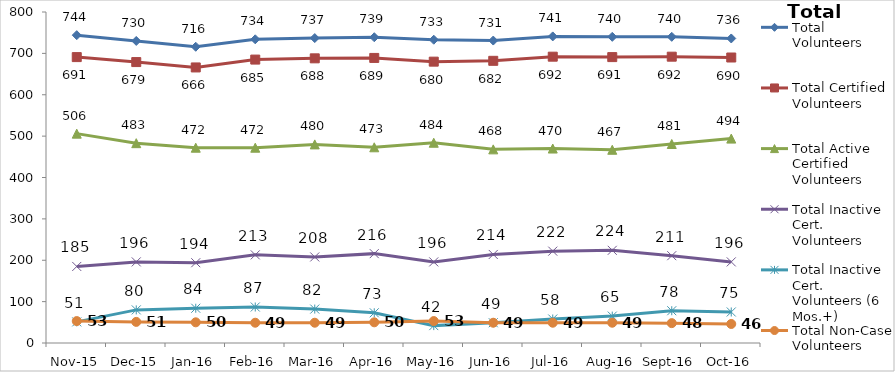
| Category | Total Volunteers | Total Certified Volunteers | Total Active Certified Volunteers | Total Inactive Cert. Volunteers | Total Inactive Cert. Volunteers (6 Mos.+) | Total Non-Case Volunteers |
|---|---|---|---|---|---|---|
| Nov-15 | 744 | 691 | 506 | 185 | 51 | 53 |
| Dec-15 | 730 | 679 | 483 | 196 | 80 | 51 |
| Jan-16 | 716 | 666 | 472 | 194 | 84 | 50 |
| Feb-16 | 734 | 685 | 472 | 213 | 87 | 49 |
| Mar-16 | 737 | 688 | 480 | 208 | 82 | 49 |
| Apr-16 | 739 | 689 | 473 | 216 | 73 | 50 |
| May-16 | 733 | 680 | 484 | 196 | 42 | 53 |
| Jun-16 | 731 | 682 | 468 | 214 | 49 | 49 |
| Jul-16 | 741 | 692 | 470 | 222 | 58 | 49 |
| Aug-16 | 740 | 691 | 467 | 224 | 65 | 49 |
| Sep-16 | 740 | 692 | 481 | 211 | 78 | 48 |
| Oct-16 | 736 | 690 | 494 | 196 | 75 | 46 |